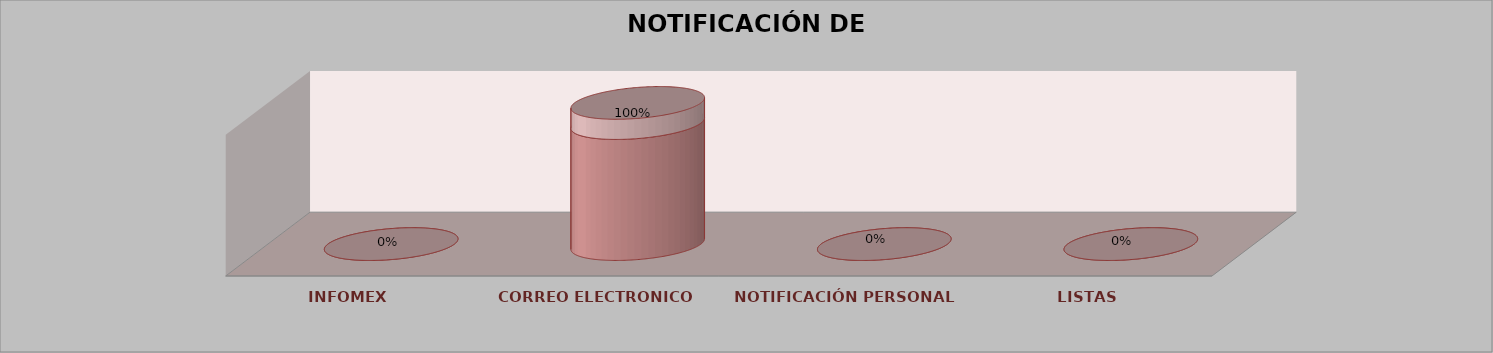
| Category | Series 0 | Series 1 | Series 2 | Series 3 | Series 4 |
|---|---|---|---|---|---|
| INFOMEX |  |  |  | 0 | 0 |
| CORREO ELECTRONICO |  |  |  | 6 | 1 |
| NOTIFICACIÓN PERSONAL |  |  |  | 0 | 0 |
| LISTAS |  |  |  | 0 | 0 |